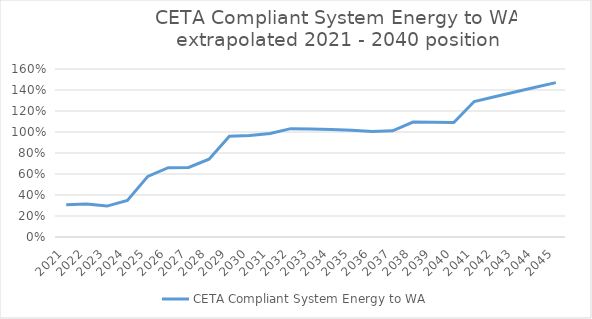
| Category | CETA Compliant System Energy to WA |
|---|---|
| 2021.0 | 0.306 |
| 2022.0 | 0.313 |
| 2023.0 | 0.294 |
| 2024.0 | 0.348 |
| 2025.0 | 0.577 |
| 2026.0 | 0.661 |
| 2027.0 | 0.663 |
| 2028.0 | 0.741 |
| 2029.0 | 0.96 |
| 2030.0 | 0.967 |
| 2031.0 | 0.985 |
| 2032.0 | 1.032 |
| 2033.0 | 1.029 |
| 2034.0 | 1.025 |
| 2035.0 | 1.017 |
| 2036.0 | 1.005 |
| 2037.0 | 1.012 |
| 2038.0 | 1.094 |
| 2039.0 | 1.092 |
| 2040.0 | 1.09 |
| 2041.0 | 1.29 |
| 2042.0 | 1.335 |
| 2043.0 | 1.381 |
| 2044.0 | 1.426 |
| 2045.0 | 1.471 |